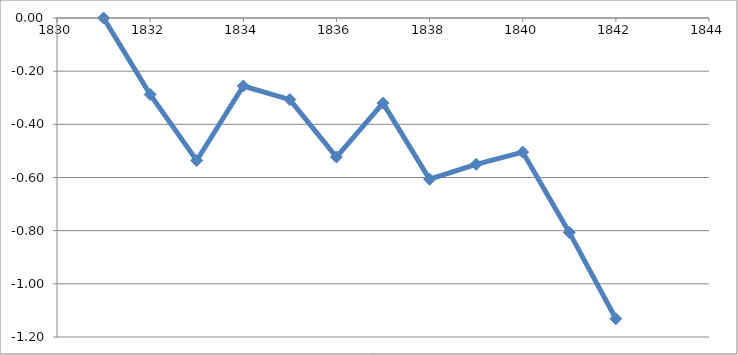
| Category | Series 0 |
|---|---|
| 1831.0 | 0 |
| 1832.0 | -0.288 |
| 1833.0 | -0.536 |
| 1834.0 | -0.256 |
| 1835.0 | -0.307 |
| 1836.0 | -0.523 |
| 1837.0 | -0.32 |
| 1838.0 | -0.606 |
| 1839.0 | -0.55 |
| 1840.0 | -0.505 |
| 1841.0 | -0.807 |
| 1842.0 | -1.131 |